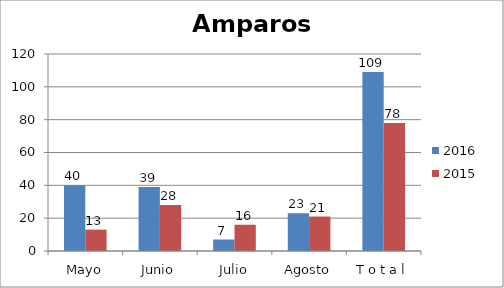
| Category | 2016 | 2015 |
|---|---|---|
| Mayo | 40 | 13 |
| Junio | 39 | 28 |
| Julio | 7 | 16 |
| Agosto | 23 | 21 |
| T o t a l | 109 | 78 |